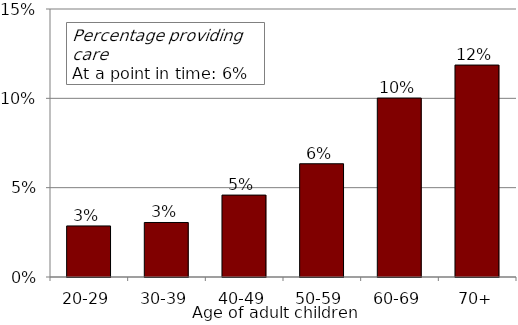
| Category | Caring for parent |
|---|---|
| 20-29 | 0.029 |
| 30-39 | 0.031 |
| 40-49 | 0.046 |
| 50-59 | 0.063 |
| 60-69 | 0.1 |
| 70+ | 0.119 |